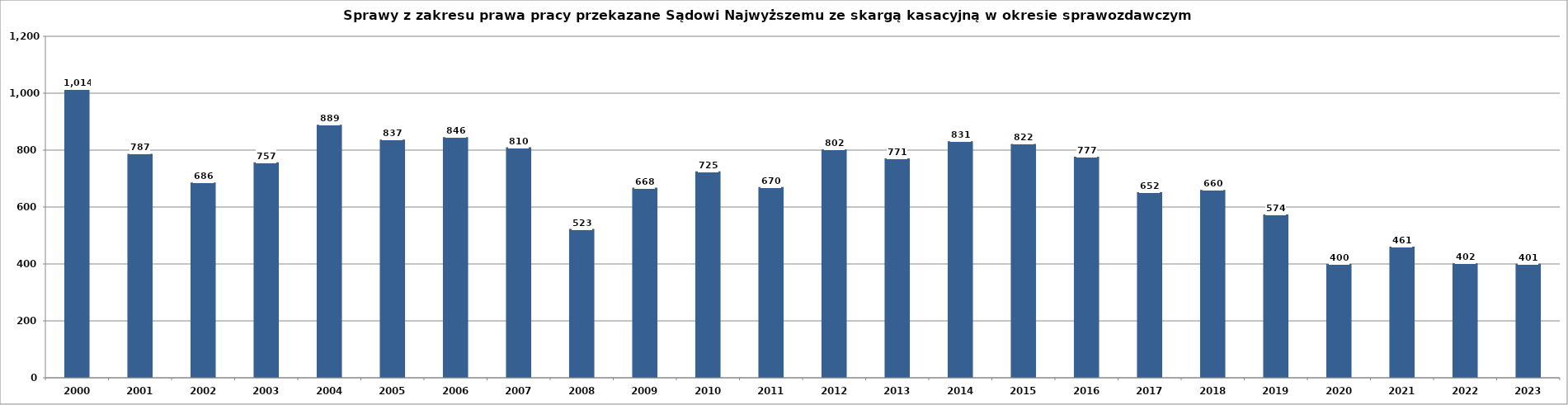
| Category | Series 0 |
|---|---|
| 2000.0 | 1014 |
| 2001.0 | 787 |
| 2002.0 | 686 |
| 2003.0 | 757 |
| 2004.0 | 889 |
| 2005.0 | 837 |
| 2006.0 | 846 |
| 2007.0 | 810 |
| 2008.0 | 523 |
| 2009.0 | 668 |
| 2010.0 | 725 |
| 2011.0 | 670 |
| 2012.0 | 802 |
| 2013.0 | 771 |
| 2014.0 | 831 |
| 2015.0 | 822 |
| 2016.0 | 777 |
| 2017.0 | 652 |
| 2018.0 | 660 |
| 2019.0 | 574 |
| 2020.0 | 400 |
| 2021.0 | 461 |
| 2022.0 | 402 |
| 2023.0 | 401 |